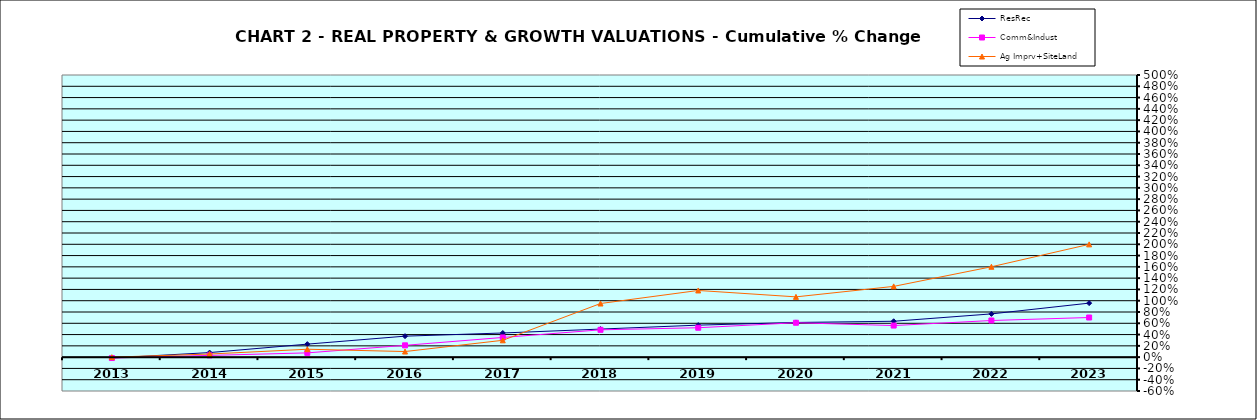
| Category | ResRec | Comm&Indust | Ag Imprv+SiteLand |
|---|---|---|---|
| 2013.0 | -0.015 | -0.016 | 0 |
| 2014.0 | 0.081 | 0.031 | 0.055 |
| 2015.0 | 0.231 | 0.076 | 0.14 |
| 2016.0 | 0.372 | 0.209 | 0.099 |
| 2017.0 | 0.428 | 0.349 | 0.298 |
| 2018.0 | 0.497 | 0.484 | 0.95 |
| 2019.0 | 0.567 | 0.521 | 1.182 |
| 2020.0 | 0.615 | 0.61 | 1.068 |
| 2021.0 | 0.636 | 0.56 | 1.254 |
| 2022.0 | 0.766 | 0.649 | 1.601 |
| 2023.0 | 0.957 | 0.703 | 1.999 |